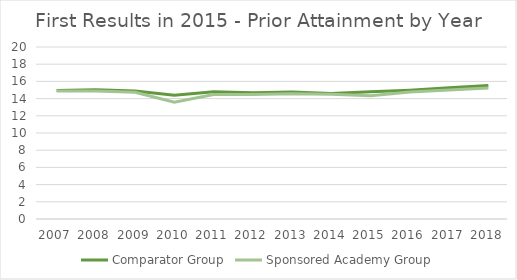
| Category | Comparator Group | Sponsored Academy Group |
|---|---|---|
| 2007.0 | 14.95 | 14.892 |
| 2008.0 | 15.033 | 14.88 |
| 2009.0 | 14.887 | 14.734 |
| 2010.0 | 14.401 | 13.587 |
| 2011.0 | 14.783 | 14.467 |
| 2012.0 | 14.675 | 14.486 |
| 2013.0 | 14.758 | 14.573 |
| 2014.0 | 14.585 | 14.492 |
| 2015.0 | 14.805 | 14.324 |
| 2016.0 | 14.981 | 14.767 |
| 2017.0 | 15.248 | 15.002 |
| 2018.0 | 15.53 | 15.244 |